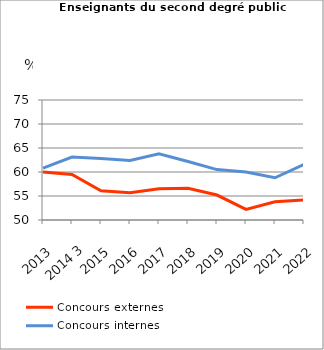
| Category | Concours externes  | Concours internes |
|---|---|---|
| 2013 | 60 | 60.8 |
| 2014 3 | 59.5 | 63.1 |
| 2015 | 56.1 | 62.8 |
| 2016 | 55.7 | 62.4 |
| 2017 | 56.5 | 63.8 |
| 2018 | 56.6 | 62.2 |
| 2019 | 55.2 | 60.5 |
| 2020 | 52.2 | 60 |
| 2021 | 53.8 | 58.8 |
| 2022 | 54.2 | 61.6 |